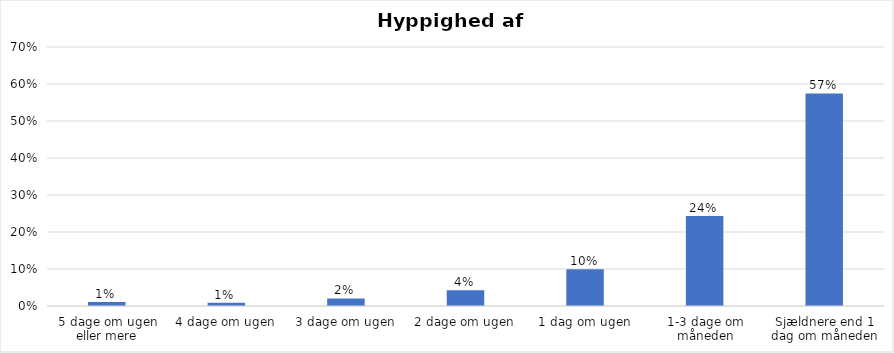
| Category | % |
|---|---|
| 5 dage om ugen eller mere | 0.011 |
| 4 dage om ugen | 0.009 |
| 3 dage om ugen | 0.021 |
| 2 dage om ugen | 0.042 |
| 1 dag om ugen | 0.099 |
| 1-3 dage om måneden | 0.243 |
| Sjældnere end 1 dag om måneden | 0.575 |